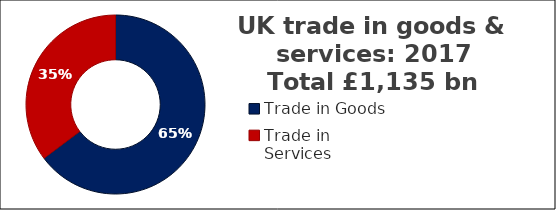
| Category |  £ billion  |
|---|---|
| Trade in Goods | 814.513 |
| Trade in Services | 443.753 |